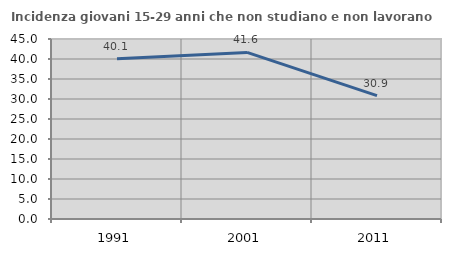
| Category | Incidenza giovani 15-29 anni che non studiano e non lavorano  |
|---|---|
| 1991.0 | 40.088 |
| 2001.0 | 41.638 |
| 2011.0 | 30.859 |